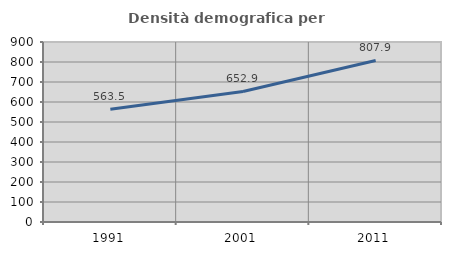
| Category | Densità demografica |
|---|---|
| 1991.0 | 563.47 |
| 2001.0 | 652.923 |
| 2011.0 | 807.858 |